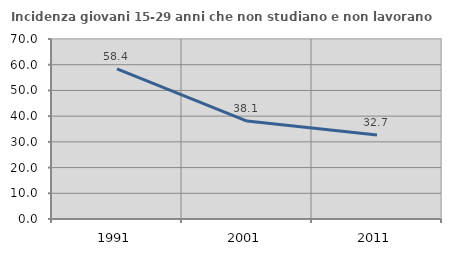
| Category | Incidenza giovani 15-29 anni che non studiano e non lavorano  |
|---|---|
| 1991.0 | 58.418 |
| 2001.0 | 38.079 |
| 2011.0 | 32.683 |